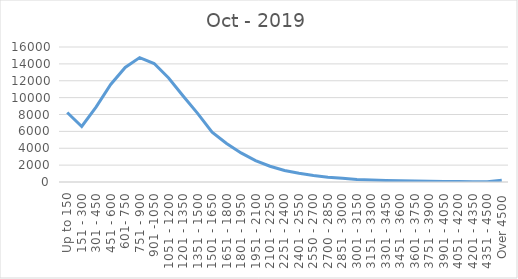
| Category | Oct - 2019 |
|---|---|
| Up to 150 | 8236 |
| 151 - 300 | 6578 |
| 301 - 450 | 8911 |
| 451 - 600 | 11555 |
| 601- 750 | 13575 |
| 751 - 900 | 14740 |
| 901 -1050 | 14043 |
| 1051 - 1200 | 12329 |
| 1201 - 1350 | 10197 |
| 1351 - 1500 | 8129 |
| 1501 - 1650 | 5915 |
| 1651 - 1800 | 4571 |
| 1801 - 1950 | 3446 |
| 1951 - 2100 | 2545 |
| 2101 - 2250 | 1865 |
| 2251 - 2400 | 1357 |
| 2401 - 2550 | 1044 |
| 2550 - 2700 | 779 |
| 2700 - 2850 | 566 |
| 2851 - 3000 | 435 |
| 3001 - 3150 | 294 |
| 3151 - 3300 | 223 |
| 3301 - 3450 | 182 |
| 3451 - 3600 | 138 |
| 3601 - 3750 | 113 |
| 3751 - 3900 | 80 |
| 3901 - 4050 | 61 |
| 4051 - 4200 | 59 |
| 4201 - 4350 | 42 |
| 4351 - 4500 | 42 |
| Over 4500 | 221 |